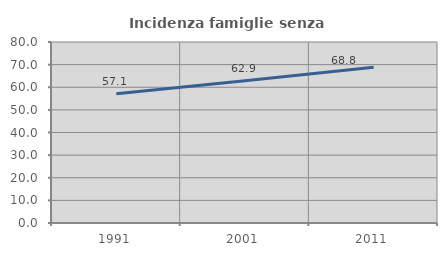
| Category | Incidenza famiglie senza nuclei |
|---|---|
| 1991.0 | 57.143 |
| 2001.0 | 62.893 |
| 2011.0 | 68.841 |